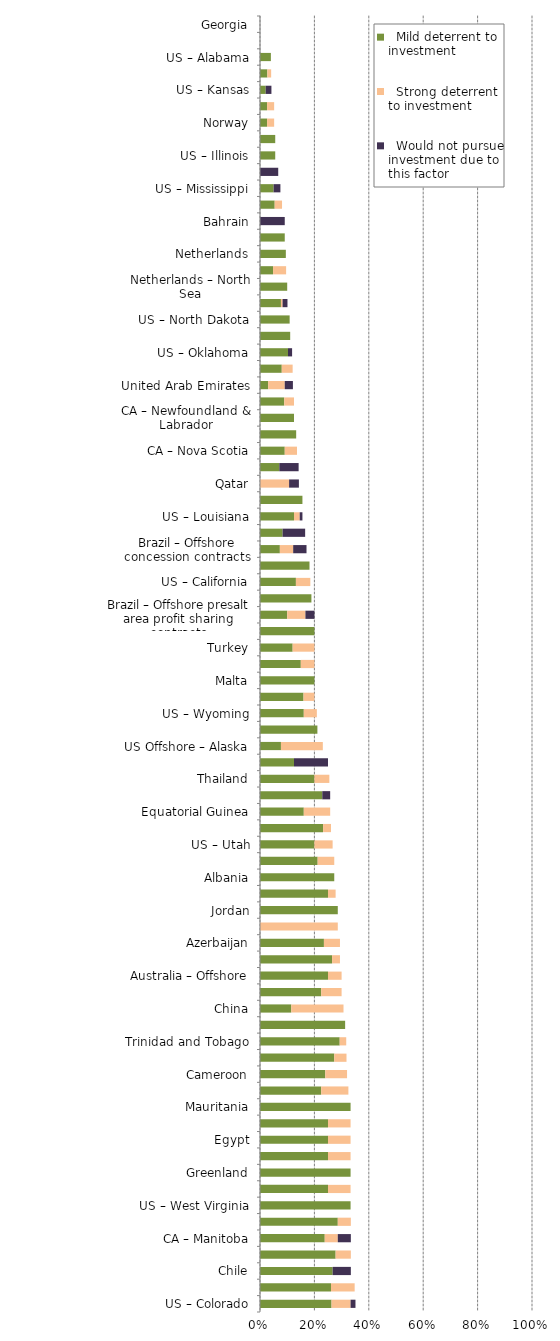
| Category |   Mild deterrent to investment |   Strong deterrent to investment |   Would not pursue investment due to this factor |
|---|---|---|---|
| US – Colorado | 0.263 | 0.07 | 0.018 |
| Morocco | 0.261 | 0.087 | 0 |
| Chile | 0.267 | 0 | 0.067 |
| Suriname | 0.278 | 0.056 | 0 |
| CA – Manitoba | 0.238 | 0.048 | 0.048 |
| Pakistan | 0.286 | 0.048 | 0 |
| US – West Virginia | 0.333 | 0 | 0 |
| Bulgaria | 0.25 | 0.083 | 0 |
| Greenland | 0.333 | 0 | 0 |
| Hungary | 0.25 | 0.083 | 0 |
| Egypt | 0.25 | 0.083 | 0 |
| Lebanon | 0.25 | 0.083 | 0 |
| Mauritania | 0.333 | 0 | 0 |
| US – New Mexico | 0.225 | 0.1 | 0 |
| Cameroon | 0.24 | 0.08 | 0 |
| Italy | 0.273 | 0.045 | 0 |
| Trinidad and Tobago | 0.293 | 0.024 | 0 |
| Ivory Coast | 0.313 | 0 | 0 |
| China | 0.115 | 0.192 | 0 |
| US – Montana | 0.225 | 0.075 | 0 |
| Australia – Offshore | 0.25 | 0.05 | 0 |
| Kazakhstan | 0.265 | 0.029 | 0 |
| Azerbaijan | 0.235 | 0.059 | 0 |
| US Offshore – Pacific | 0 | 0.286 | 0 |
| Jordan | 0.286 | 0 | 0 |
| Angola | 0.25 | 0.028 | 0 |
| Albania | 0.273 | 0 | 0 |
| Algeria | 0.212 | 0.061 | 0 |
| US – Utah | 0.2 | 0.067 | 0 |
| Malaysia | 0.232 | 0.029 | 0 |
| Equatorial Guinea | 0.161 | 0.097 | 0 |
| Tunisia | 0.229 | 0 | 0.029 |
| Thailand | 0.2 | 0.055 | 0 |
| Uruguay | 0.125 | 0 | 0.125 |
| US Offshore – Alaska | 0.077 | 0.154 | 0 |
| Namibia | 0.211 | 0 | 0 |
| US – Wyoming | 0.161 | 0.048 | 0 |
| Brunei | 0.16 | 0.04 | 0 |
| Malta | 0.2 | 0 | 0 |
| Spain – Onshore | 0.15 | 0.05 | 0 |
| Turkey | 0.12 | 0.08 | 0 |
| Botswana | 0.2 | 0 | 0 |
| Brazil – Offshore presalt area profit sharing contracts | 0.1 | 0.067 | 0.033 |
| US – Pennsylvania | 0.189 | 0 | 0 |
| US – California | 0.132 | 0.053 | 0 |
| Seychelles | 0.182 | 0 | 0 |
| Brazil – Offshore concession contracts | 0.073 | 0.049 | 0.049 |
| Kuwait | 0.083 | 0 | 0.083 |
| US – Louisiana | 0.125 | 0.021 | 0.01 |
| US – Ohio | 0.156 | 0 | 0 |
| Qatar | 0 | 0.107 | 0.036 |
| Poland | 0.071 | 0 | 0.071 |
| CA – Nova Scotia | 0.091 | 0.045 | 0 |
| Germany | 0.133 | 0 | 0 |
| CA – Newfoundland & Labrador | 0.125 | 0 | 0 |
| US Offshore – Gulf of Mexico | 0.089 | 0.036 | 0 |
| United Arab Emirates | 0.03 | 0.061 | 0.03 |
| Oman | 0.08 | 0.04 | 0 |
| US – Oklahoma | 0.103 | 0 | 0.015 |
| Faroe Islands | 0.111 | 0 | 0 |
| US – North Dakota | 0.109 | 0 | 0 |
| US – Texas | 0.077 | 0.006 | 0.018 |
| Netherlands – North Sea | 0.1 | 0 | 0 |
| Spain – Offshore | 0.048 | 0.048 | 0 |
| Netherlands | 0.095 | 0 | 0 |
| US – Michigan | 0.091 | 0 | 0 |
| Bahrain | 0 | 0 | 0.091 |
| United Kingdom | 0.054 | 0.027 | 0 |
| US – Mississippi | 0.05 | 0 | 0.025 |
| Ireland | 0 | 0 | 0.067 |
| US – Illinois | 0.056 | 0 | 0 |
| Denmark | 0.056 | 0 | 0 |
| Norway | 0.026 | 0.026 | 0 |
| Norway – North Sea | 0.026 | 0.026 | 0 |
| US – Kansas | 0.021 | 0 | 0.021 |
| United Kingdom – North Sea | 0.027 | 0.014 | 0 |
| US – Alabama | 0.04 | 0 | 0 |
| US – Arkansas | 0 | 0 | 0 |
| Georgia | 0 | 0 | 0 |